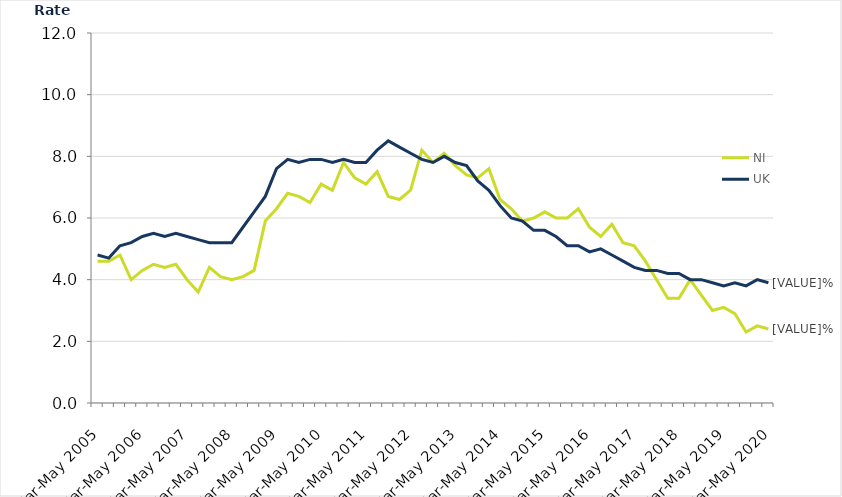
| Category | NI | UK |
|---|---|---|
| Mar-May 2005 | 4.6 | 4.8 |
| Jun-Aug 2005 | 4.6 | 4.7 |
| Sep-Nov 2005 | 4.8 | 5.1 |
| Dec-Feb 2006 | 4 | 5.2 |
| Mar-May 2006 | 4.3 | 5.4 |
| Jun-Aug 2006 | 4.5 | 5.5 |
| Sep-Nov 2006 | 4.4 | 5.4 |
| Dec-Feb 2007 | 4.5 | 5.5 |
| Mar-May 2007 | 4 | 5.4 |
| Jun-Aug 2007 | 3.6 | 5.3 |
| Sep-Nov 2007 | 4.4 | 5.2 |
| Dec-Feb 2008 | 4.1 | 5.2 |
| Mar-May 2008 | 4 | 5.2 |
| Jun-Aug 2008 | 4.1 | 5.7 |
| Sep-Nov 2008 | 4.3 | 6.2 |
| Dec-Feb 2009 | 5.9 | 6.7 |
| Mar-May 2009 | 6.3 | 7.6 |
| Jun-Aug 2009 | 6.8 | 7.9 |
| Sep-Nov 2009 | 6.7 | 7.8 |
| Dec-Feb 2010 | 6.5 | 7.9 |
| Mar-May 2010 | 7.1 | 7.9 |
| Jun-Aug 2010 | 6.9 | 7.8 |
| Sep-Nov 2010 | 7.8 | 7.9 |
| Dec-Feb 2011 | 7.3 | 7.8 |
| Mar-May 2011 | 7.1 | 7.8 |
| Jun-Aug 2011 | 7.5 | 8.2 |
| Sep-Nov 2011 | 6.7 | 8.5 |
| Dec-Feb 2012 | 6.6 | 8.3 |
| Mar-May 2012 | 6.9 | 8.1 |
| Jun-Aug 2012 | 8.2 | 7.9 |
| Sep-Nov 2012 | 7.8 | 7.8 |
| Dec-Feb 2013 | 8.1 | 8 |
| Mar-May 2013 | 7.7 | 7.8 |
| Jun-Aug 2013 | 7.4 | 7.7 |
| Sep-Nov 2013 | 7.3 | 7.2 |
| Dec-Feb 2014 | 7.6 | 6.9 |
| Mar-May 2014 | 6.6 | 6.4 |
| Jun-Aug 2014 | 6.3 | 6 |
| Sep-Nov 2014 | 5.9 | 5.9 |
| Dec-Feb 2015 | 6 | 5.6 |
| Mar-May 2015 | 6.2 | 5.6 |
| Jun-Aug 2015 | 6 | 5.4 |
| Sep-Nov 2015 | 6 | 5.1 |
| Dec-Feb 2016 | 6.3 | 5.1 |
| Mar-May 2016 | 5.7 | 4.9 |
| Jun-Aug 2016 | 5.4 | 5 |
| Sep-Nov 2016 | 5.8 | 4.8 |
| Dec-Feb 2017 | 5.2 | 4.6 |
| Mar-May 2017 | 5.1 | 4.4 |
| Jun-Aug 2017 | 4.6 | 4.3 |
| Sep-Nov 2017 | 4 | 4.3 |
| Dec-Feb 2018 | 3.4 | 4.2 |
| Mar-May 2018 | 3.4 | 4.2 |
| Jun-Aug 2018 | 4 | 4 |
| Sep-Nov 2018 | 3.5 | 4 |
| Dec-Feb 2019 | 3 | 3.9 |
| Mar-May 2019 | 3.1 | 3.8 |
| Jun-Aug 2019 | 2.9 | 3.9 |
| Sep-Nov 2019 | 2.3 | 3.8 |
| Dec-Feb 2020 | 2.5 | 4 |
| Mar-May 2020 | 2.4 | 3.9 |